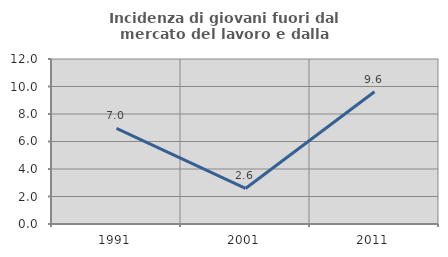
| Category | Incidenza di giovani fuori dal mercato del lavoro e dalla formazione  |
|---|---|
| 1991.0 | 6.957 |
| 2001.0 | 2.586 |
| 2011.0 | 9.615 |